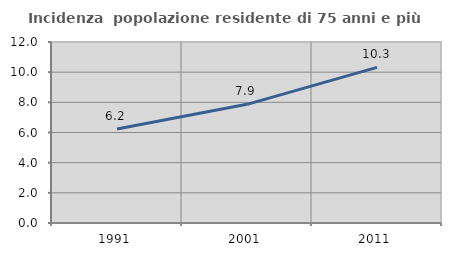
| Category | Incidenza  popolazione residente di 75 anni e più |
|---|---|
| 1991.0 | 6.232 |
| 2001.0 | 7.867 |
| 2011.0 | 10.317 |